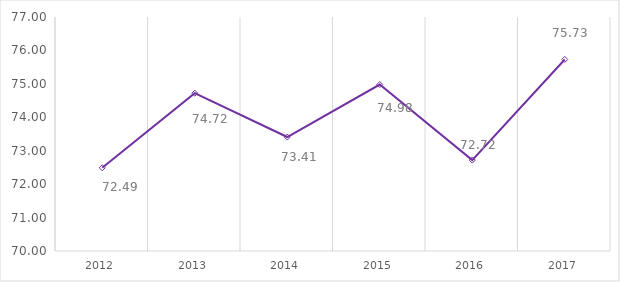
| Category | Series 0 |
|---|---|
| 2012.0 | 72.49 |
| 2013.0 | 74.72 |
| 2014.0 | 73.41 |
| 2015.0 | 74.98 |
| 2016.0 | 72.72 |
| 2017.0 | 75.73 |